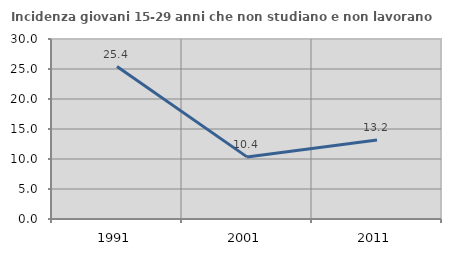
| Category | Incidenza giovani 15-29 anni che non studiano e non lavorano  |
|---|---|
| 1991.0 | 25.412 |
| 2001.0 | 10.352 |
| 2011.0 | 13.181 |